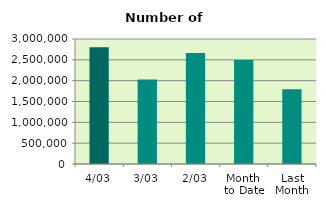
| Category | Series 0 |
|---|---|
| 4/03 | 2801308 |
| 3/03 | 2027682 |
| 2/03 | 2665018 |
| Month 
to Date | 2497760 |
| Last
Month | 1795830.8 |